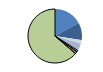
| Category | Series 0 |
|---|---|
| ARRASTRE | 104 |
| CERCO | 64 |
| ATUNEROS CAÑEROS | 0 |
| PALANGRE DE FONDO | 13 |
| PALANGRE DE SUPERFICIE | 25 |
| RASCO | 2 |
| VOLANTA | 6 |
| ARTES FIJAS | 8 |
| ARTES MENORES | 390 |